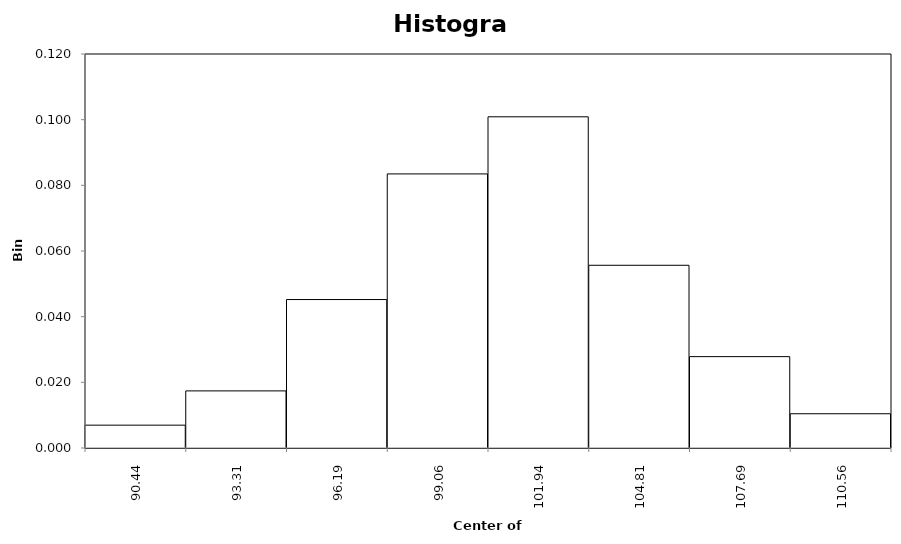
| Category | Series 0 |
|---|---|
| 90.4375 | 0.007 |
| 93.3125 | 0.017 |
| 96.1875 | 0.045 |
| 99.0625 | 0.083 |
| 101.9375 | 0.101 |
| 104.8125 | 0.056 |
| 107.6875 | 0.028 |
| 110.5625 | 0.01 |